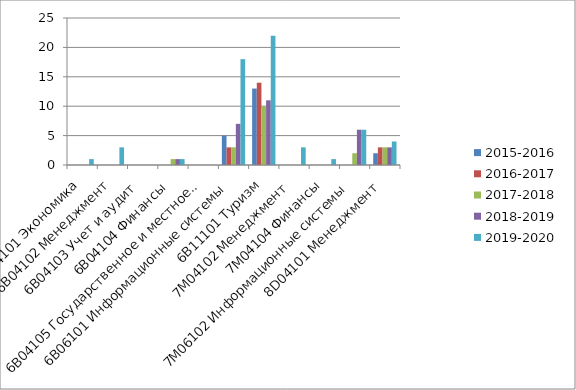
| Category | 2015-2016 | 2016-2017 | 2017-2018 | 2018-2019 | 2019-2020 |
|---|---|---|---|---|---|
| _x0011_6В04101 Экономика | 0 | 0 | 0 | 0 | 1 |
| _x0012_6В04102 Менеджмент | 0 | 0 | 0 | 0 | 3 |
| _x0014_6В04103 Учет и аудит | 0 | 0 | 0 | 0 | 0 |
| _x000f_6В04104 Финансы | 0 | 0 | 1 | 1 | 1 |
| ,6В04105 Государственное и местное управление | 0 | 0 | 0 | 0 | 0 |
| _x001e_6В06101 Информационные системы | 5 | 3 | 3 | 7 | 18 |
| _x000e_6В11101 Туризм | 13 | 14 | 10 | 11 | 22 |
| _x0012_7М04102 Менеджмент | 0 | 0 | 0 | 0 | 3 |
| _x000f_7М04104 Финансы | 0 | 0 | 0 | 0 | 1 |
| _x001e_7М06102 Информационные системы | 0 | 0 | 2 | 6 | 6 |
| _x0012_8D04101 Менеджмент | 2 | 3 | 3 | 3 | 4 |